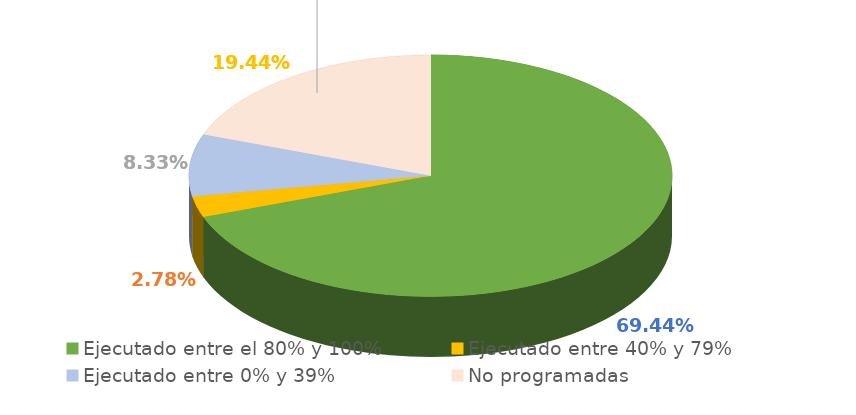
| Category | Series 0 |
|---|---|
| Ejecutado entre el 80% y 100% | 0.694 |
| Ejecutado entre 40% y 79% | 0.028 |
| Ejecutado entre 0% y 39% | 0.083 |
| No programadas | 0.194 |